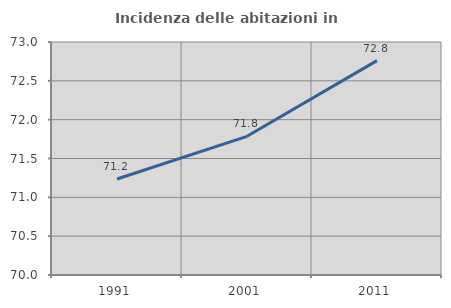
| Category | Incidenza delle abitazioni in proprietà  |
|---|---|
| 1991.0 | 71.236 |
| 2001.0 | 71.786 |
| 2011.0 | 72.76 |